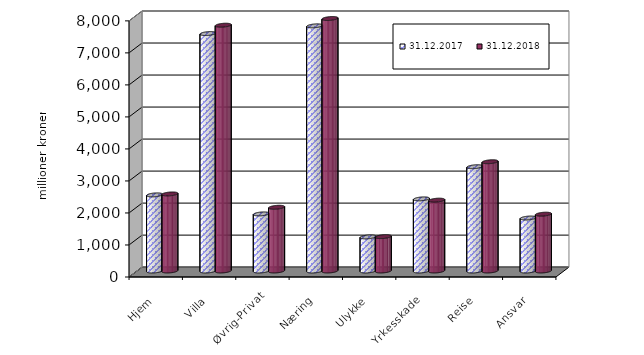
| Category | 31.12.2017 | 31.12.2018 |
|---|---|---|
| Hjem | 2377.827 | 2407.073 |
| Villa | 7416.783 | 7676.975 |
| Øvrig-Privat | 1783.724 | 1990.471 |
| Næring | 7657.329 | 7886.392 |
| Ulykke | 1065.668 | 1074.309 |
| Yrkesskade | 2252.802 | 2212.689 |
| Reise | 3257.013 | 3412.928 |
| Ansvar | 1654.829 | 1774.859 |